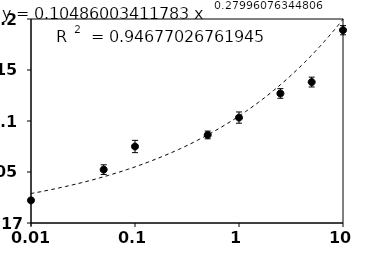
| Category | Series 0 |
|---|---|
| 25.0 | 0.292 |
| 10.0 | 0.189 |
| 5.0 | 0.138 |
| 2.5 | 0.127 |
| 1.0 | 0.103 |
| 0.5 | 0.086 |
| 0.1 | 0.075 |
| 0.05 | 0.052 |
| 0.01 | 0.022 |